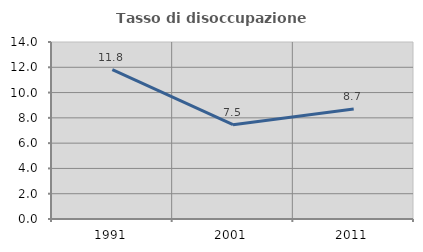
| Category | Tasso di disoccupazione giovanile  |
|---|---|
| 1991.0 | 11.818 |
| 2001.0 | 7.463 |
| 2011.0 | 8.696 |